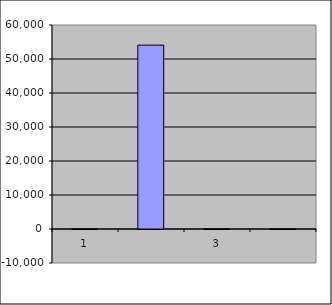
| Category | Series 0 |
|---|---|
| 0 | 8.25 |
| 1 | 54082.508 |
| 2 | -3.9 |
| 3 | 7.252 |